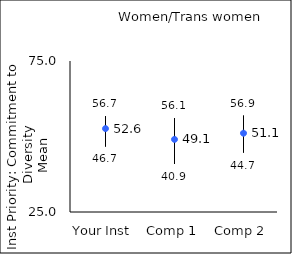
| Category | 25th percentile | 75th percentile | Mean |
|---|---|---|---|
| Your Inst | 46.7 | 56.7 | 52.62 |
| Comp 1 | 40.9 | 56.1 | 49.05 |
| Comp 2 | 44.7 | 56.9 | 51.09 |